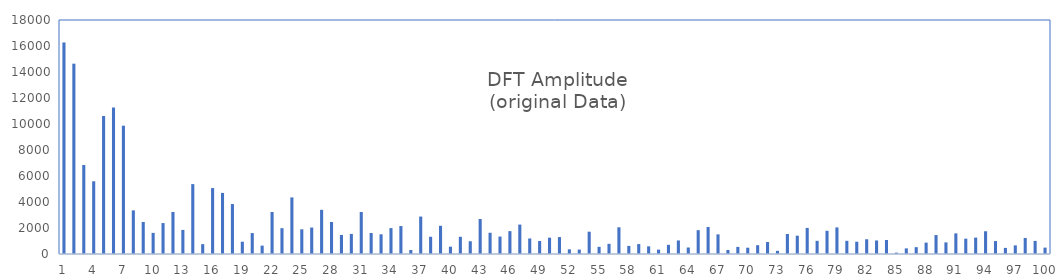
| Category | Series 0 |
|---|---|
| 0 | 16271.438 |
| 1 | 14639.955 |
| 2 | 6846.23 |
| 3 | 5591.555 |
| 4 | 10619.115 |
| 5 | 11266.102 |
| 6 | 9870.136 |
| 7 | 3354.944 |
| 8 | 2463.972 |
| 9 | 1625.018 |
| 10 | 2378.734 |
| 11 | 3233.536 |
| 12 | 1852.129 |
| 13 | 5376.368 |
| 14 | 758.81 |
| 15 | 5071.117 |
| 16 | 4700.331 |
| 17 | 3842.28 |
| 18 | 944.931 |
| 19 | 1610.154 |
| 20 | 644.632 |
| 21 | 3230.272 |
| 22 | 1986.356 |
| 23 | 4352.606 |
| 24 | 1899.752 |
| 25 | 2034.473 |
| 26 | 3398.312 |
| 27 | 2459.839 |
| 28 | 1466.493 |
| 29 | 1544.598 |
| 30 | 3232.235 |
| 31 | 1615.661 |
| 32 | 1514.863 |
| 33 | 1992.909 |
| 34 | 2149.335 |
| 35 | 309.883 |
| 36 | 2880.232 |
| 37 | 1325.589 |
| 38 | 2170.723 |
| 39 | 562.721 |
| 40 | 1324.406 |
| 41 | 980.664 |
| 42 | 2693.587 |
| 43 | 1633.806 |
| 44 | 1341.102 |
| 45 | 1759.667 |
| 46 | 2263.853 |
| 47 | 1193.873 |
| 48 | 998.381 |
| 49 | 1254.987 |
| 50 | 1301.279 |
| 51 | 359.806 |
| 52 | 341.171 |
| 53 | 1716.21 |
| 54 | 551.565 |
| 55 | 782.619 |
| 56 | 2054.462 |
| 57 | 623.396 |
| 58 | 763.796 |
| 59 | 589.649 |
| 60 | 336.177 |
| 61 | 704.58 |
| 62 | 1041.973 |
| 63 | 500.018 |
| 64 | 1834.246 |
| 65 | 2075.297 |
| 66 | 1511.225 |
| 67 | 311.108 |
| 68 | 546.73 |
| 69 | 483.655 |
| 70 | 677.708 |
| 71 | 919.856 |
| 72 | 242.52 |
| 73 | 1540.329 |
| 74 | 1408.501 |
| 75 | 2006.109 |
| 76 | 1013.925 |
| 77 | 1782.56 |
| 78 | 2044.473 |
| 79 | 1015.123 |
| 80 | 944.776 |
| 81 | 1133.571 |
| 82 | 1041.966 |
| 83 | 1078.756 |
| 84 | 104.482 |
| 85 | 433.074 |
| 86 | 526.925 |
| 87 | 875.673 |
| 88 | 1456.654 |
| 89 | 894.457 |
| 90 | 1587.336 |
| 91 | 1178.075 |
| 92 | 1261.532 |
| 93 | 1749.273 |
| 94 | 995.802 |
| 95 | 468.331 |
| 96 | 662.835 |
| 97 | 1234.066 |
| 98 | 1008.331 |
| 99 | 490.302 |